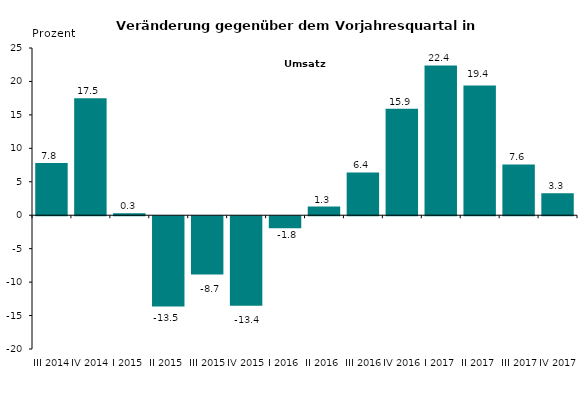
| Category | 7,8 17,5 0,3 -13,5 -8,7 -13,4 -1,8 1,3 6,4 15,9 22,4 19,4 7,6 3,3 |
|---|---|
| III 2014 | 7.8 |
| IV 2014 | 17.5 |
| I 2015 | 0.3 |
| II 2015 | -13.5 |
| III 2015 | -8.7 |
| IV 2015 | -13.4 |
| I 2016 | -1.8 |
| II 2016 | 1.3 |
| III 2016 | 6.4 |
| IV 2016 | 15.9 |
| I 2017 | 22.4 |
| II 2017 | 19.4 |
| III 2017 | 7.6 |
| IV 2017 | 3.3 |